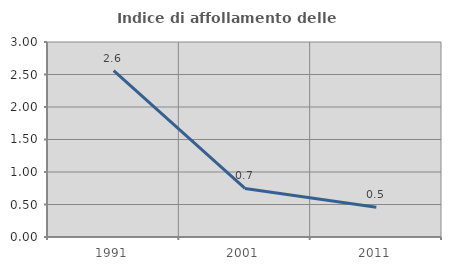
| Category | Indice di affollamento delle abitazioni  |
|---|---|
| 1991.0 | 2.559 |
| 2001.0 | 0.748 |
| 2011.0 | 0.458 |